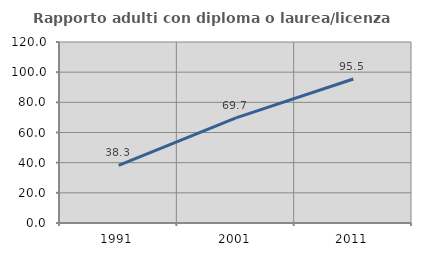
| Category | Rapporto adulti con diploma o laurea/licenza media  |
|---|---|
| 1991.0 | 38.272 |
| 2001.0 | 69.745 |
| 2011.0 | 95.479 |